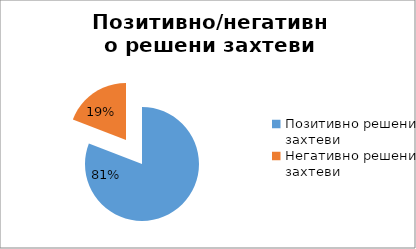
| Category | Series 0 |
|---|---|
| Позитивно решени захтеви | 27564 |
| Негативно решени захтеви | 6511 |